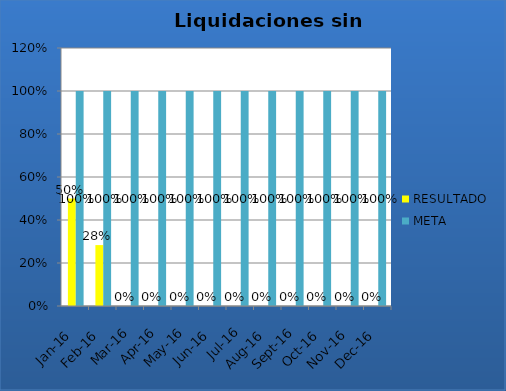
| Category | RESULTADO | META |
|---|---|---|
| ene-16 | 0.5 | 1 |
| feb-16 | 0.283 | 1 |
| mar-16 | 0 | 1 |
| abr-16 | 0 | 1 |
| may-16 | 0 | 1 |
| jun-16 | 0 | 1 |
| jul-16 | 0 | 1 |
| ago-16 | 0 | 1 |
| sep-16 | 0 | 1 |
| oct-16 | 0 | 1 |
| nov-16 | 0 | 1 |
| dic-16 | 0 | 1 |